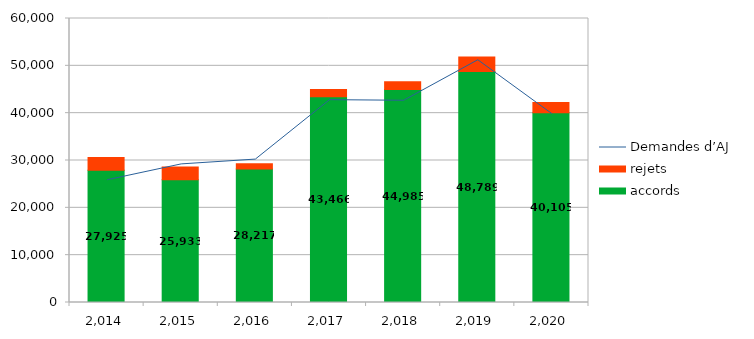
| Category | accords | rejets |
|---|---|---|
| 2 014 | 27925 | 2726 |
| 2 015 | 25933 | 2694 |
| 2 016 | 28217 | 1107 |
| 2 017 | 43466 | 1523 |
| 2 018 | 44985 | 1654 |
| 2 019 | 48789 | 3099 |
| 2 020 | 40105 | 2156 |